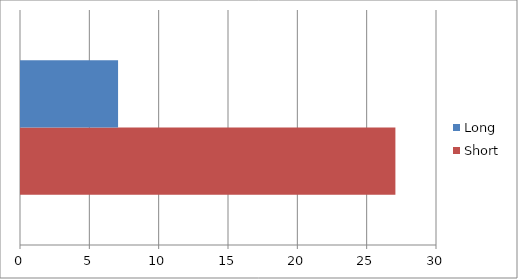
| Category | Short | Long |
|---|---|---|
| 0 | 27 | 7 |